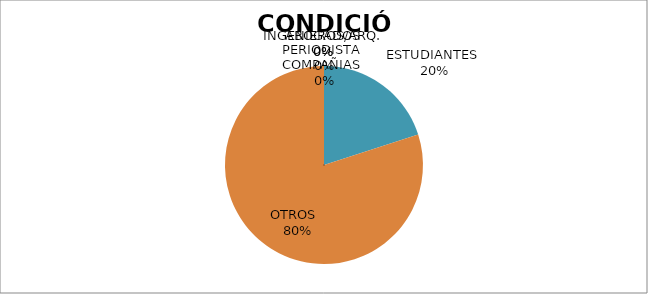
| Category | Series 0 |
|---|---|
| ABOGADOS | 0 |
| PERIODISTA  | 0 |
| COMPAÑIAS  | 0 |
| INGENIEROS/ARQ. | 0 |
| ESTUDIANTES  | 1 |
| OTROS   | 4 |